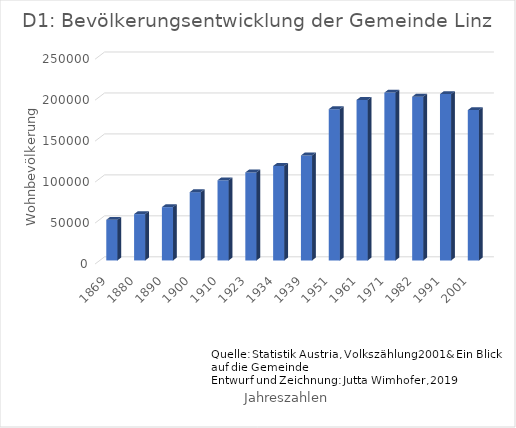
| Category | Series 0 |
|---|---|
| 1869.0 | 49635 |
| 1880.0 | 56569 |
| 1890.0 | 65090 |
| 1900.0 | 83356 |
| 1910.0 | 97852 |
| 1923.0 | 107463 |
| 1934.0 | 115328 |
| 1939.0 | 128177 |
| 1951.0 | 184685 |
| 1961.0 | 195978 |
| 1971.0 | 204889 |
| 1982.0 | 199910 |
| 1991.0 | 203044 |
| 2001.0 | 183504 |